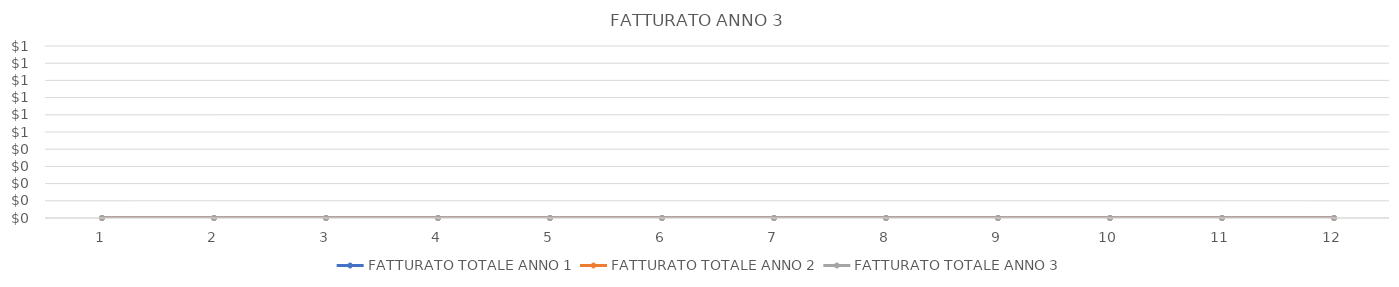
| Category | FATTURATO TOTALE ANNO 1 | FATTURATO TOTALE ANNO 2 | FATTURATO TOTALE ANNO 3 |
|---|---|---|---|
| 0 | 0 | 0 | 0 |
| 1 | 0 | 0 | 0 |
| 2 | 0 | 0 | 0 |
| 3 | 0 | 0 | 0 |
| 4 | 0 | 0 | 0 |
| 5 | 0 | 0 | 0 |
| 6 | 0 | 0 | 0 |
| 7 | 0 | 0 | 0 |
| 8 | 0 | 0 | 0 |
| 9 | 0 | 0 | 0 |
| 10 | 0 | 0 | 0 |
| 11 | 0 | 0 | 0 |